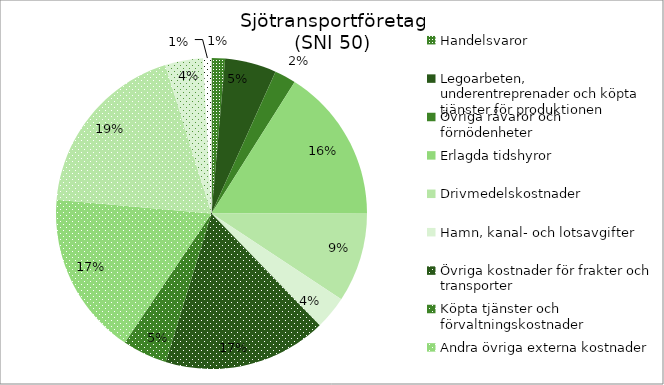
| Category | Series 0 |
|---|---|
| Handelsvaror | 482.59 |
| Legoarbeten, underentreprenader och köpta tjänster för produktionen | 1844.402 |
| Övriga råvaror och förnödenheter | 766.337 |
| Erlagda tidshyror | 5497.846 |
| Drivmedelskostnader | 3221.062 |
| Hamn, kanal- och lotsavgifter | 1192.362 |
| Övriga kostnader för frakter och transporter | 5861.545 |
| Köpta tjänster och förvaltningskostnader | 1599.916 |
| Andra övriga externa kostnader | 5853.209 |
| Personalkostnader | 6472.755 |
| Avskrivningar | 1364.643 |
| Övriga rörelsekostnader | 290.824 |